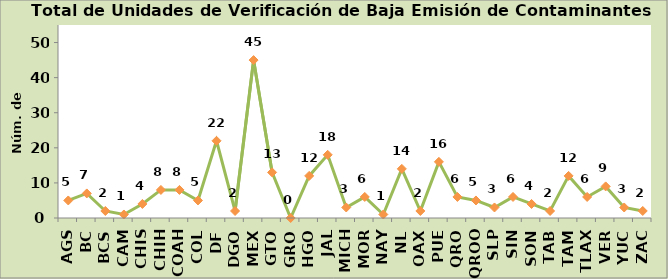
| Category | Total |
|---|---|
| AGS | 5 |
| BC | 7 |
| BCS | 2 |
| CAM | 1 |
| CHIS | 4 |
| CHIH | 8 |
| COAH | 8 |
| COL | 5 |
| DF | 22 |
| DGO | 2 |
| MEX | 45 |
| GTO | 13 |
| GRO | 0 |
| HGO | 12 |
| JAL | 18 |
| MICH | 3 |
| MOR | 6 |
| NAY | 1 |
| NL | 14 |
| OAX | 2 |
| PUE | 16 |
| QRO | 6 |
| QROO | 5 |
| SLP | 3 |
| SIN | 6 |
| SON | 4 |
| TAB | 2 |
| TAM | 12 |
| TLAX | 6 |
| VER | 9 |
| YUC | 3 |
| ZAC | 2 |